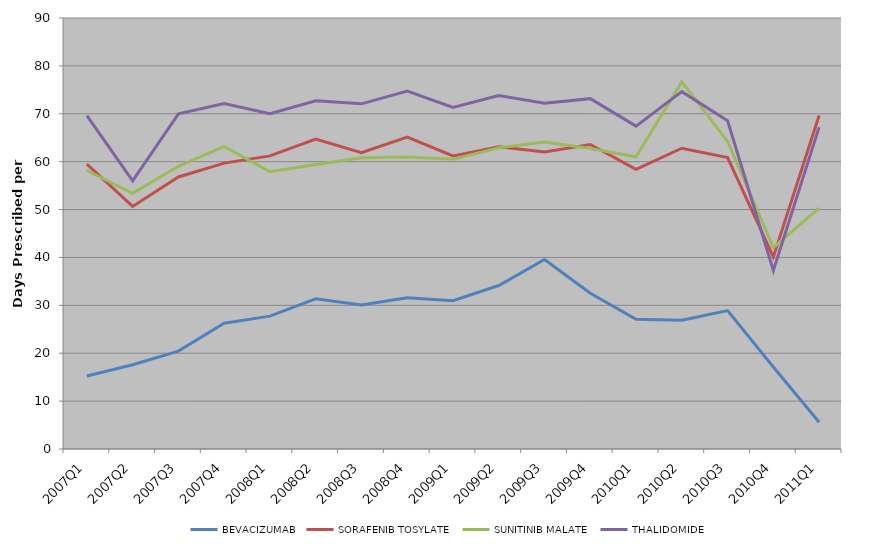
| Category | BEVACIZUMAB | SORAFENIB TOSYLATE | SUNITINIB MALATE | THALIDOMIDE |
|---|---|---|---|---|
| 2007Q1 | 15.232 | 59.492 | 58.157 | 69.608 |
| 2007Q2 | 17.593 | 50.649 | 53.411 | 55.977 |
| 2007Q3 | 20.437 | 56.803 | 59.05 | 69.995 |
| 2007Q4 | 26.259 | 59.702 | 63.172 | 72.146 |
| 2008Q1 | 27.742 | 61.209 | 57.882 | 70.008 |
| 2008Q2 | 31.362 | 64.716 | 59.413 | 72.73 |
| 2008Q3 | 30.092 | 61.885 | 60.804 | 72.073 |
| 2008Q4 | 31.563 | 65.141 | 60.996 | 74.731 |
| 2009Q1 | 30.954 | 61.197 | 60.482 | 71.311 |
| 2009Q2 | 34.133 | 63.112 | 62.891 | 73.831 |
| 2009Q3 | 39.563 | 62.019 | 64.107 | 72.212 |
| 2009Q4 | 32.531 | 63.587 | 62.755 | 73.157 |
| 2010Q1 | 27.09 | 58.409 | 61.022 | 67.423 |
| 2010Q2 | 26.886 | 62.805 | 76.653 | 74.624 |
| 2010Q3 | 28.907 | 60.861 | 64.225 | 68.542 |
| 2010Q4 | 17.11 | 40.113 | 42.075 | 37.27 |
| 2011Q1 | 5.6 | 69.643 | 50.308 | 67.2 |